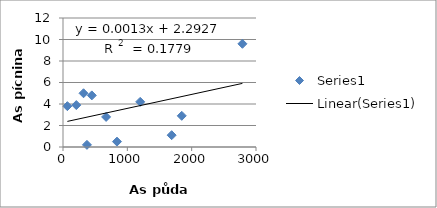
| Category | Series 0 |
|---|---|
| 2789.0 | 9.6 |
| 1200.0 | 4.2 |
| 319.0 | 5 |
| 68.0 | 3.8 |
| 448.0 | 4.8 |
| 1846.0 | 2.9 |
| 670.0 | 2.8 |
| 207.0 | 3.9 |
| 839.0 | 0.5 |
| 372.0 | 0.2 |
| 1689.0 | 1.1 |